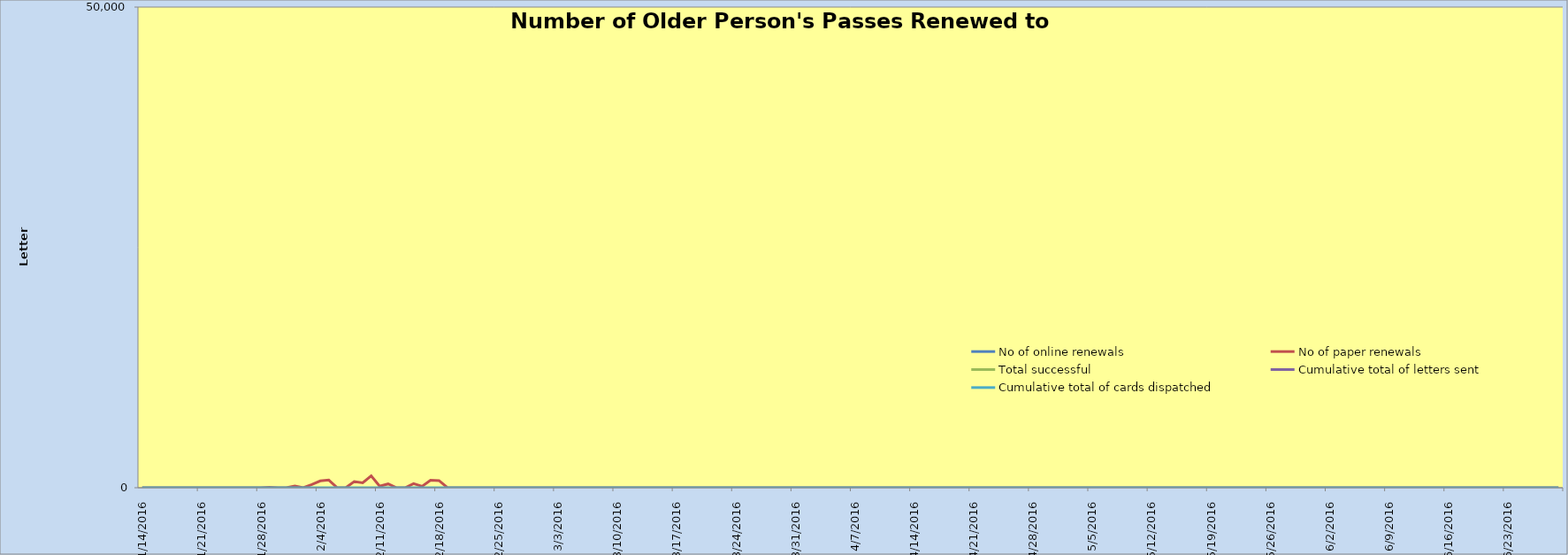
| Category | No of online renewals | No of paper renewals | Total successful | Cumulative total of letters sent  | Cumulative total of cards dispatched  |
|---|---|---|---|---|---|
| 1/14/16 |  | 0 |  |  | 0 |
| 1/15/16 |  | 0 |  |  | 0 |
| 1/16/16 |  | 0 |  |  | 0 |
| 1/17/16 |  | 0 |  |  | 0 |
| 1/18/16 |  | 0 |  |  | 0 |
| 1/19/16 |  | 0 |  |  | 0 |
| 1/20/16 |  | 0 |  |  | 0 |
| 1/21/16 |  | 0 |  |  | 0 |
| 1/22/16 |  | 0 |  |  | 0 |
| 1/23/16 |  | 0 |  |  | 0 |
| 1/24/16 |  | 0 |  |  | 0 |
| 1/25/16 |  | 0 |  |  | 0 |
| 1/26/16 |  | 6 |  |  | 0 |
| 1/27/16 |  | 1 |  |  | 0 |
| 1/28/16 |  | 2 |  |  | 0 |
| 1/29/16 |  | 50 |  |  | 0 |
| 1/30/16 |  | 0 |  |  | 0 |
| 1/31/16 |  | 0 |  |  | 0 |
| 2/1/16 |  | 178 |  |  | 0 |
| 2/2/16 |  | 0 |  |  | 0 |
| 2/3/16 |  | 334 |  |  | 0 |
| 2/4/16 |  | 705 |  |  | 0 |
| 2/5/16 |  | 794 |  |  | 0 |
| 2/6/16 |  | 0 |  |  | 0 |
| 2/7/16 |  | 0 |  |  | 0 |
| 2/8/16 |  | 644 |  |  | 0 |
| 2/9/16 |  | 508 |  |  | 0 |
| 2/10/16 |  | 1237 |  |  | 0 |
| 2/11/16 |  | 160 |  |  | 0 |
| 2/12/16 |  | 398 |  |  | 0 |
| 2/13/16 |  | 0 |  |  | 0 |
| 2/14/16 |  | 0 |  |  | 0 |
| 2/15/16 |  | 427 |  |  | 0 |
| 2/16/16 |  | 150 |  |  | 0 |
| 2/17/16 |  | 786 |  |  | 0 |
| 2/18/16 |  | 744 |  |  | 0 |
| 2/19/16 |  | 0 |  |  | 0 |
| 2/20/16 |  | 0 |  |  | 0 |
| 2/21/16 |  | 0 |  |  | 0 |
| 2/22/16 |  | 0 |  |  | 0 |
| 2/23/16 |  | 0 |  |  | 0 |
| 2/24/16 |  | 0 |  |  | 0 |
| 2/25/16 |  | 0 |  |  | 0 |
| 2/26/16 |  | 0 |  |  | 0 |
| 2/27/16 |  | 0 |  |  | 0 |
| 2/28/16 |  | 0 |  |  | 0 |
| 2/29/16 |  | 0 |  |  | 0 |
| 3/1/16 |  | 0 |  |  | 0 |
| 3/2/16 |  | 0 |  |  | 0 |
| 3/3/16 |  | 0 |  |  | 0 |
| 3/4/16 |  | 0 |  |  | 0 |
| 3/5/16 |  | 0 |  |  | 0 |
| 3/6/16 |  | 0 |  |  | 0 |
| 3/7/16 |  | 0 |  |  | 0 |
| 3/8/16 |  | 0 |  |  | 0 |
| 3/9/16 |  | 0 |  |  | 0 |
| 3/10/16 |  | 0 |  |  | 0 |
| 3/11/16 |  | 0 |  |  | 0 |
| 3/12/16 |  | 0 |  |  | 0 |
| 3/13/16 |  | 0 |  |  | 0 |
| 3/14/16 |  | 0 |  |  | 0 |
| 3/15/16 |  | 0 |  |  | 0 |
| 3/16/16 |  | 0 |  |  | 0 |
| 3/17/16 |  | 2 |  |  | 0 |
| 3/18/16 |  | 0 |  |  | 0 |
| 3/19/16 |  | 0 |  |  | 0 |
| 3/20/16 |  | 0 |  |  | 0 |
| 3/21/16 |  | 0 |  |  | 0 |
| 3/22/16 |  | 0 |  |  | 0 |
| 3/23/16 |  | 0 |  |  | 0 |
| 3/24/16 |  | 0 |  |  | 0 |
| 3/25/16 |  | 0 |  |  | 0 |
| 3/26/16 |  | 0 |  |  | 0 |
| 3/27/16 |  | 0 |  |  | 0 |
| 3/28/16 |  | 0 |  |  | 0 |
| 3/29/16 |  | 0 |  |  | 0 |
| 3/30/16 |  | 0 |  |  | 0 |
| 3/31/16 |  | 0 |  |  | 0 |
| 4/1/16 |  | 0 |  |  | 0 |
| 4/2/16 |  | 0 |  |  | 0 |
| 4/3/16 |  | 0 |  |  | 0 |
| 4/4/16 |  | 0 |  |  | 0 |
| 4/5/16 |  | 0 |  |  | 0 |
| 4/6/16 |  | 0 |  |  | 0 |
| 4/7/16 |  | 0 |  |  | 0 |
| 4/8/16 |  | 0 |  |  | 0 |
| 4/9/16 |  | 0 |  |  | 0 |
| 4/10/16 |  | 0 |  |  | 0 |
| 4/11/16 |  | 0 |  |  | 0 |
| 4/12/16 |  | 0 |  |  | 0 |
| 4/13/16 |  | 0 |  |  | 0 |
| 4/14/16 |  | 0 |  |  | 0 |
| 4/15/16 |  | 0 |  |  | 0 |
| 4/16/16 |  | 0 |  |  | 0 |
| 4/17/16 |  | 0 |  |  | 0 |
| 4/18/16 |  | 0 |  |  | 0 |
| 4/19/16 |  | 0 |  |  | 0 |
| 4/20/16 |  | 0 |  |  | 0 |
| 4/21/16 |  | 0 |  |  | 0 |
| 4/22/16 |  | 0 |  |  | 0 |
| 4/23/16 |  | 0 |  |  | 0 |
| 4/24/16 |  | 0 |  |  | 0 |
| 4/25/16 |  | 0 |  |  | 0 |
| 4/26/16 |  | 0 |  |  | 0 |
| 4/27/16 |  | 0 |  |  | 0 |
| 4/28/16 |  | 0 |  |  | 0 |
| 4/29/16 |  | 0 |  |  | 0 |
| 4/30/16 |  | 0 |  |  | 0 |
| 5/1/16 |  | 0 |  |  | 0 |
| 5/2/16 |  | 0 |  |  | 0 |
| 5/3/16 |  | 0 |  |  | 0 |
| 5/4/16 |  | 0 |  |  | 0 |
| 5/5/16 |  | 0 |  |  | 0 |
| 5/6/16 |  | 0 |  |  | 0 |
| 5/7/16 |  | 0 |  |  | 0 |
| 5/8/16 |  | 0 |  |  | 0 |
| 5/9/16 |  | 0 |  |  | 0 |
| 5/10/16 |  | 0 |  |  | 0 |
| 5/11/16 |  | 0 |  |  | 0 |
| 5/12/16 |  | 0 |  |  | 0 |
| 5/13/16 |  | 0 |  |  | 0 |
| 5/14/16 |  | 0 |  |  | 0 |
| 5/15/16 |  | 0 |  |  | 0 |
| 5/16/16 |  | 0 |  |  | 0 |
| 5/17/16 |  | 0 |  |  | 0 |
| 5/18/16 |  | 0 |  |  | 0 |
| 5/19/16 |  | 0 |  |  | 0 |
| 5/20/16 |  | 0 |  |  | 0 |
| 5/21/16 |  | 0 |  |  | 0 |
| 5/22/16 |  | 0 |  |  | 0 |
| 5/23/16 |  | 0 |  |  | 0 |
| 5/24/16 |  | 0 |  |  | 0 |
| 5/25/16 |  | 0 |  |  | 0 |
| 5/26/16 |  | 0 |  |  | 0 |
| 5/27/16 |  | 0 |  |  | 0 |
| 5/28/16 |  | 0 |  |  | 0 |
| 5/29/16 |  | 0 |  |  | 0 |
| 5/30/16 |  | 0 |  |  | 0 |
| 5/31/16 |  | 0 |  |  | 0 |
| 6/1/16 |  | 0 |  |  | 0 |
| 6/2/16 |  | 0 |  |  | 0 |
| 6/3/16 |  | 0 |  |  | 0 |
| 6/4/16 |  | 0 |  |  | 0 |
| 6/5/16 |  | 0 |  |  | 0 |
| 6/6/16 |  | 0 |  |  | 0 |
| 6/7/16 |  | 0 |  |  | 0 |
| 6/8/16 |  | 0 |  |  | 0 |
| 6/9/16 |  | 0 |  |  | 0 |
| 6/10/16 |  | 0 |  |  | 0 |
| 6/11/16 |  | 0 |  |  | 0 |
| 6/12/16 |  | 0 |  |  | 0 |
| 6/13/16 |  | 0 |  |  | 0 |
| 6/14/16 |  | 0 |  |  | 0 |
| 6/15/16 |  | 0 |  |  | 0 |
| 6/16/16 |  | 0 |  |  | 0 |
| 6/17/16 |  | 0 |  |  | 0 |
| 6/18/16 |  | 0 |  |  | 0 |
| 6/19/16 |  | 0 |  |  | 0 |
| 6/20/16 |  | 0 |  |  | 0 |
| 6/21/16 |  | 0 |  |  | 0 |
| 6/22/16 |  | 0 |  |  | 0 |
| 6/23/16 |  | 0 |  |  | 0 |
| 6/24/16 |  | 0 |  |  | 0 |
| 6/25/16 |  | 0 |  |  | 0 |
| 6/26/16 |  | 0 |  |  | 0 |
| 6/27/16 |  | 0 |  |  | 0 |
| 6/28/16 |  | 0 |  |  | 0 |
| 6/29/16 |  | 0 |  |  | 0 |